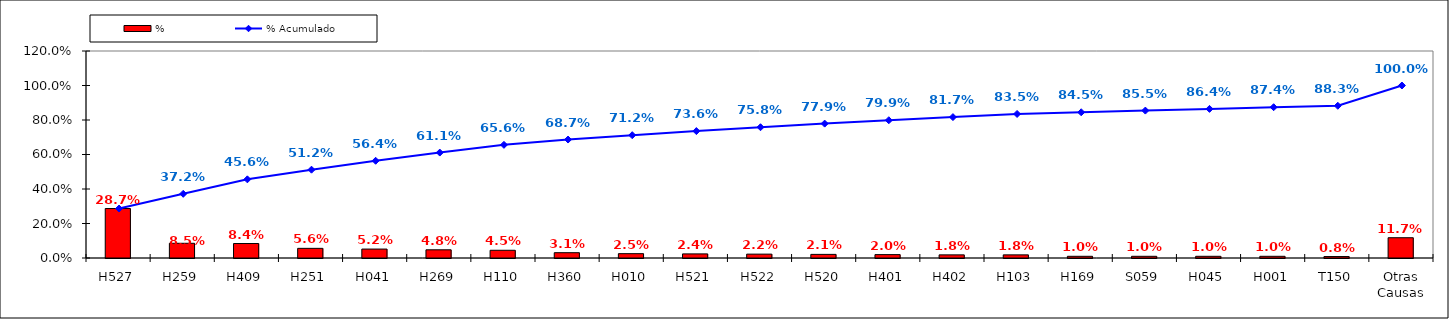
| Category | % |
|---|---|
| H527 | 0.287 |
| H259 | 0.085 |
| H409 | 0.084 |
| H251 | 0.056 |
| H041 | 0.052 |
| H269 | 0.048 |
| H110 | 0.045 |
| H360 | 0.031 |
| H010 | 0.025 |
| H521 | 0.024 |
| H522 | 0.022 |
| H520 | 0.021 |
| H401 | 0.02 |
| H402 | 0.018 |
| H103 | 0.018 |
| H169 | 0.01 |
| S059 | 0.01 |
| H045 | 0.01 |
| H001 | 0.01 |
| T150 | 0.008 |
| Otras Causas | 0.117 |